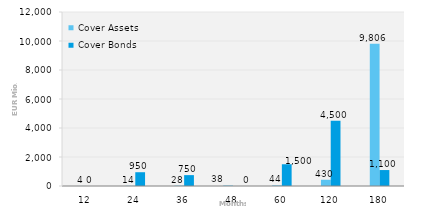
| Category | Cover Assets | Cover Bonds |
|---|---|---|
| 12.0 | 4.161 | 0 |
| 24.0 | 14.466 | 950 |
| 36.0 | 27.578 | 750 |
| 48.0 | 38.2 | 0 |
| 60.0 | 43.658 | 1500 |
| 120.0 | 429.76 | 4500 |
| 180.0 | 9806.39 | 1100 |